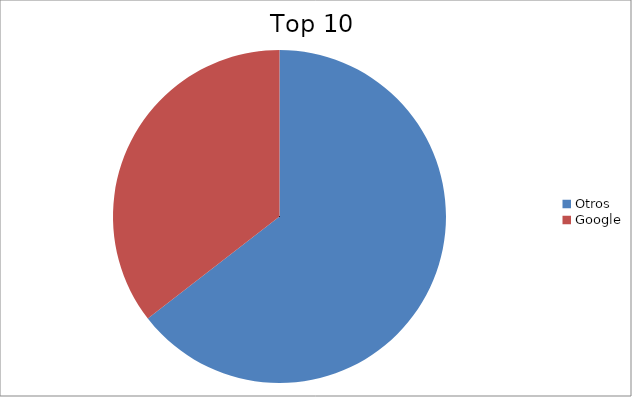
| Category | Series 0 |
|---|---|
| Otros | 64.52 |
| Google | 35.48 |